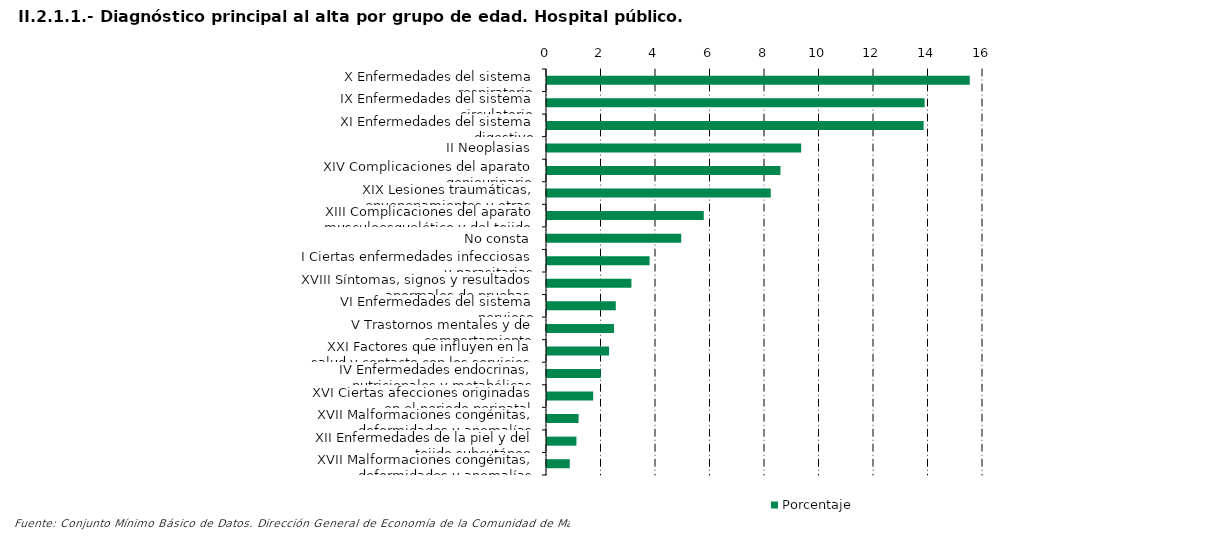
| Category | Porcentaje |
|---|---|
| X Enfermedades del sistema respiratorio | 15.513 |
| IX Enfermedades del sistema circulatorio | 13.856 |
| XI Enfermedades del sistema digestivo | 13.82 |
| II Neoplasias | 9.327 |
| XIV Complicaciones del aparato geniourinario | 8.566 |
| XIX Lesiones traumáticas, envenenamientos y otras consecuencias de causas externas | 8.211 |
| XIII Complicaciones del aparato musculoesquelético y del tejido conectivo | 5.753 |
| No consta | 4.926 |
| I Ciertas enfermedades infecciosas y parasitarias | 3.765 |
| XVIII Síntomas, signos y resultados anormales de pruebas complementarias, no clasificados bajo otro concepto | 3.097 |
| VI Enfermedades del sistema nervioso | 2.524 |
| V Trastornos mentales y de comportamiento | 2.458 |
| XXI Factores que influyen en la salud y contacto con los servicios sanitarios | 2.277 |
| IV Enfermedades endocrinas, nutricionales y metabólicas | 1.972 |
| XVI Ciertas afecciones originadas en el periodo perinatal | 1.694 |
| XVII Malformaciones congénitas, deformidades y anomalías cromosómicas | 1.158 |
| XII Enfermedades de la piel y del tejido subcutáneo | 1.081 |
| XVII Malformaciones congénitas, deformidades y anomalías cromosómicas | 0.835 |